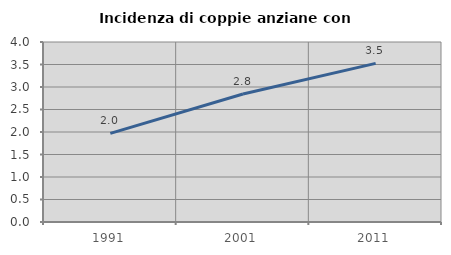
| Category | Incidenza di coppie anziane con figli |
|---|---|
| 1991.0 | 1.97 |
| 2001.0 | 2.844 |
| 2011.0 | 3.524 |